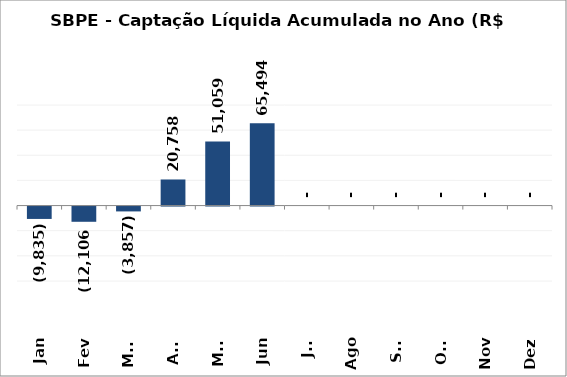
| Category | SBPE - Captação Líquida Acumulada no Ano (R$ Milhões) 2020 |
|---|---|
| Jan | -9835.145 |
| Fev | -12105.725 |
| Mar | -3856.755 |
| Abr | 20757.76 |
| Mai | 51058.921 |
| Jun | 65494.248 |
| Jul | 0 |
| Ago | 0 |
| Set | 0 |
| Out | 0 |
| Nov | 0 |
| Dez | 0 |